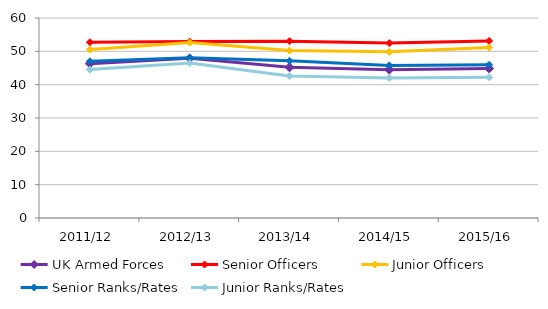
| Category | UK Armed Forces | Senior Officers | Junior Officers | Senior Ranks/Rates | Junior Ranks/Rates |
|---|---|---|---|---|---|
| 2011/12 | 46.301 | 52.746 | 50.529 | 47.009 | 44.52 |
| 2012/13 | 47.899 | 52.919 | 52.633 | 48.049 | 46.475 |
| 2013/14 | 45.2 | 53.045 | 50.221 | 47.145 | 42.585 |
| 2014/15 | 44.503 | 52.47 | 49.84 | 45.774 | 42.036 |
| 2015/16 | 44.875 | 53.121 | 51.12 | 45.938 | 42.234 |